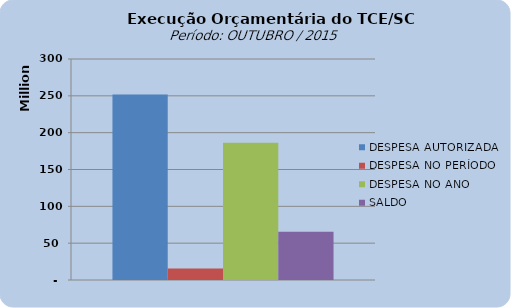
| Category | DESPESA AUTORIZADA | DESPESA NO PERÍODO | DESPESA NO ANO | SALDO |
|---|---|---|---|---|
| 0 | 251661471.33 | 15703387.28 | 186288225.94 | 65373245.39 |